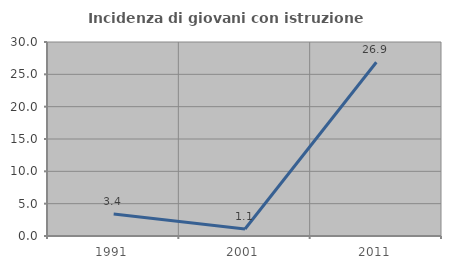
| Category | Incidenza di giovani con istruzione universitaria |
|---|---|
| 1991.0 | 3.39 |
| 2001.0 | 1.075 |
| 2011.0 | 26.866 |